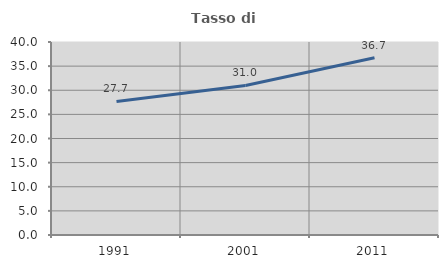
| Category | Tasso di occupazione   |
|---|---|
| 1991.0 | 27.69 |
| 2001.0 | 31.002 |
| 2011.0 | 36.729 |